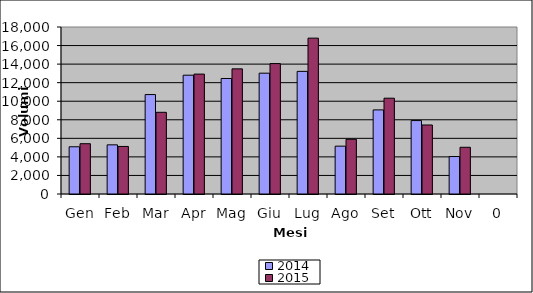
| Category | 2014 | 2015 |
|---|---|---|
| Gen | 5090 | 5421 |
| Feb | 5299 | 5126 |
| Mar | 10717 | 8805 |
| Apr | 12805 | 12923 |
| Mag | 12450 | 13488 |
| Giu | 13022 | 14056 |
| Lug | 13218 | 16799 |
| Ago | 5156 | 5897 |
| Set | 9064 | 10325 |
| Ott | 7914 | 7438 |
| Nov | 4038 | 5035 |
| 0 | 0 | 0 |